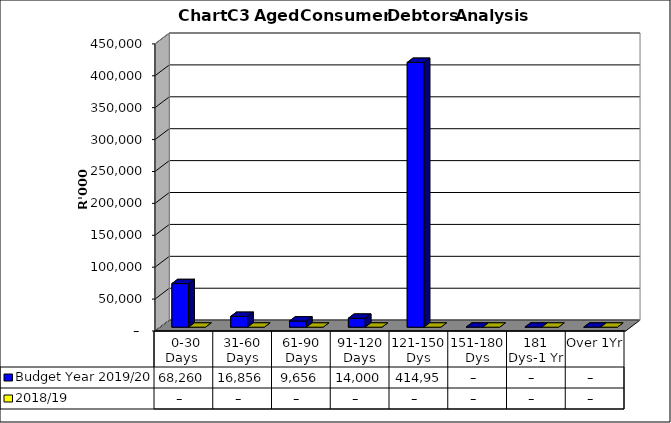
| Category | Budget Year 2019/20 | 2018/19 |
|---|---|---|
|  0-30 Days  | 68260026.66 | 0 |
| 31-60 Days | 16855633.05 | 0 |
| 61-90 Days | 9655600.13 | 0 |
| 91-120 Days | 13999697.75 | 0 |
| 121-150 Dys | 414957059.24 | 0 |
| 151-180 Dys | 0 | 0 |
| 181 Dys-1 Yr | 0 | 0 |
| Over 1Yr | 0 | 0 |